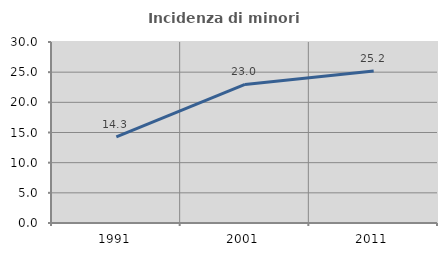
| Category | Incidenza di minori stranieri |
|---|---|
| 1991.0 | 14.286 |
| 2001.0 | 22.973 |
| 2011.0 | 25.194 |